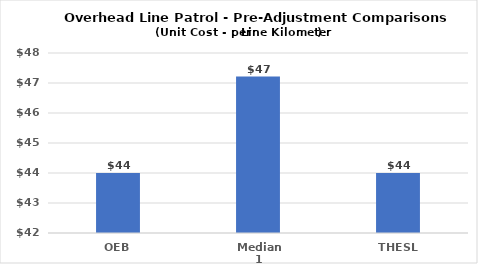
| Category | Series 0 |
|---|---|
| OEB | 44 |
| Median 1 | 47.215 |
| THESL | 44 |